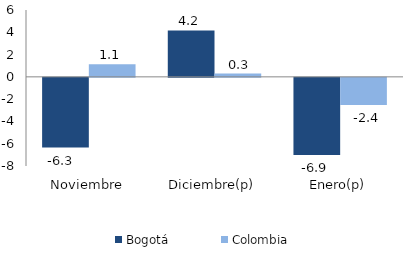
| Category | Bogotá | Colombia |
|---|---|---|
| Noviembre | -6.26 | 1.129 |
| Diciembre(p) | 4.168 | 0.295 |
| Enero(p) | -6.924 | -2.426 |